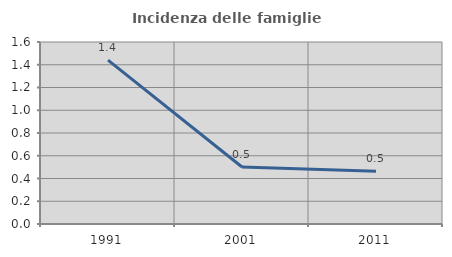
| Category | Incidenza delle famiglie numerose |
|---|---|
| 1991.0 | 1.441 |
| 2001.0 | 0.501 |
| 2011.0 | 0.463 |